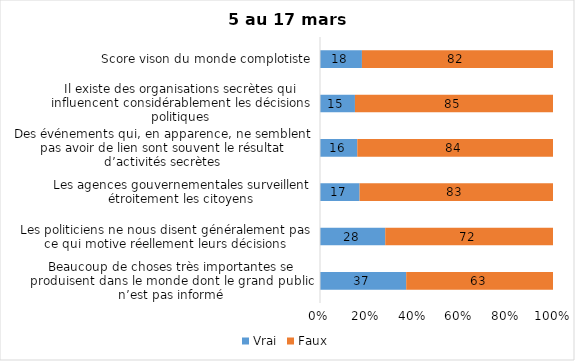
| Category | Vrai | Faux |
|---|---|---|
| Beaucoup de choses très importantes se produisent dans le monde dont le grand public n’est pas informé | 37 | 63 |
| Les politiciens ne nous disent généralement pas ce qui motive réellement leurs décisions | 28 | 72 |
| Les agences gouvernementales surveillent étroitement les citoyens | 17 | 83 |
| Des événements qui, en apparence, ne semblent pas avoir de lien sont souvent le résultat d’activités secrètes | 16 | 84 |
| Il existe des organisations secrètes qui influencent considérablement les décisions politiques | 15 | 85 |
| Score vison du monde complotiste | 18 | 82 |